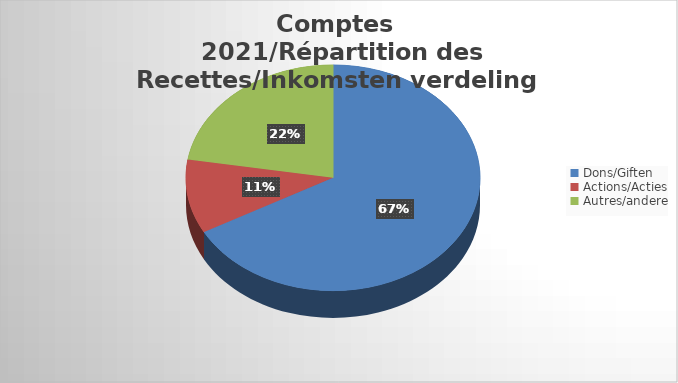
| Category | Series 0 |
|---|---|
| Dons/Giften | 3252860.07 |
| Actions/Acties | 511961.77 |
| Autres/andere | 1088240.41 |